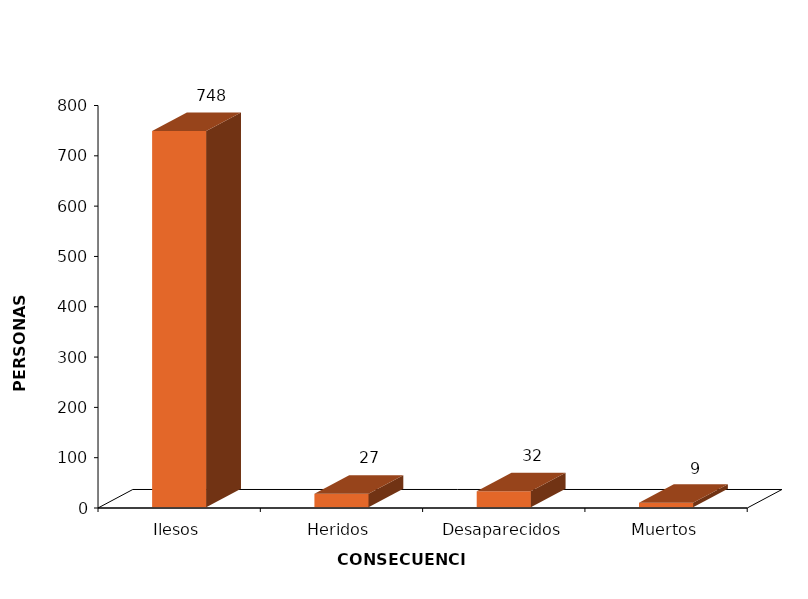
| Category | Series 0 |
|---|---|
| Ilesos | 748 |
| Heridos | 27 |
| Desaparecidos | 32 |
| Muertos | 9 |